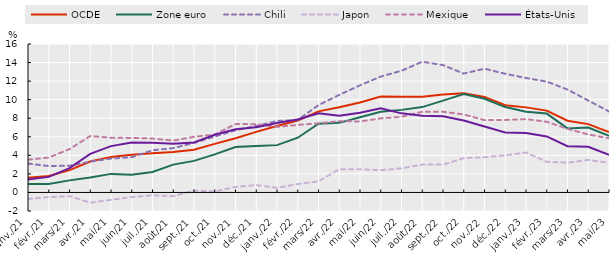
| Category | OCDE | Zone euro | Chili | Japon | Mexique | États-Unis |
|---|---|---|---|---|---|---|
| 2021-01-01 | 1.576 | 0.9 | 3.118 | -0.7 | 3.535 | 1.4 |
| 2021-02-01 | 1.766 | 0.9 | 2.846 | -0.5 | 3.759 | 1.676 |
| 2021-03-01 | 2.407 | 1.3 | 2.884 | -0.4 | 4.667 | 2.62 |
| 2021-04-01 | 3.34 | 1.6 | 3.323 | -1.1 | 6.085 | 4.16 |
| 2021-05-01 | 3.833 | 2 | 3.649 | -0.8 | 5.894 | 4.993 |
| 2021-06-01 | 4.05 | 1.9 | 3.804 | -0.5 | 5.879 | 5.391 |
| 2021-07-01 | 4.237 | 2.2 | 4.543 | -0.3 | 5.806 | 5.365 |
| 2021-08-01 | 4.358 | 3 | 4.775 | -0.4 | 5.592 | 5.251 |
| 2021-09-01 | 4.609 | 3.4 | 5.34 | 0.2 | 6 | 5.39 |
| 2021-10-01 | 5.234 | 4.1 | 6.027 | 0.1 | 6.24 | 6.222 |
| 2021-11-01 | 5.841 | 4.9 | 6.702 | 0.6 | 7.375 | 6.809 |
| 2021-12-01 | 6.53 | 5 | 7.167 | 0.8 | 7.355 | 7.036 |
| 2022-01-01 | 7.162 | 5.1 | 7.703 | 0.5 | 7.07 | 7.48 |
| 2022-02-01 | 7.749 | 5.9 | 7.809 | 0.9 | 7.28 | 7.871 |
| 2022-03-01 | 8.738 | 7.4 | 9.409 | 1.2 | 7.454 | 8.542 |
| 2022-04-01 | 9.189 | 7.5 | 10.516 | 2.5 | 7.683 | 8.259 |
| 2022-05-01 | 9.691 | 8.1 | 11.545 | 2.5 | 7.653 | 8.582 |
| 2022-06-01 | 10.328 | 8.7 | 12.491 | 2.4 | 7.986 | 9.06 |
| 2022-07-01 | 10.301 | 8.9 | 13.12 | 2.6 | 8.151 | 8.525 |
| 2022-08-01 | 10.313 | 9.2 | 14.09 | 3 | 8.695 | 8.263 |
| 2022-09-01 | 10.569 | 9.9 | 13.728 | 3 | 8.7 | 8.202 |
| 2022-10-01 | 10.689 | 10.6 | 12.812 | 3.7 | 8.407 | 7.745 |
| 2022-11-01 | 10.298 | 10.1 | 13.338 | 3.8 | 7.797 | 7.11 |
| 2022-12-01 | 9.409 | 9.2 | 12.79 | 4 | 7.817 | 6.454 |
| 2023-01-01 | 9.169 | 8.7 | 12.335 | 4.3 | 7.91 | 6.41 |
| 2023-02-01 | 8.818 | 8.5 | 11.947 | 3.3 | 7.619 | 6.036 |
| 2023-03-01 | 7.736 | 6.9 | 11.094 | 3.2 | 6.849 | 4.985 |
| 2023-04-01 | 7.366 | 7 | 9.907 | 3.5 | 6.253 | 4.93 |
| 2023-05-01 | 6.506 | 6.1 | 8.727 | 3.2 | 5.835 | 4.048 |